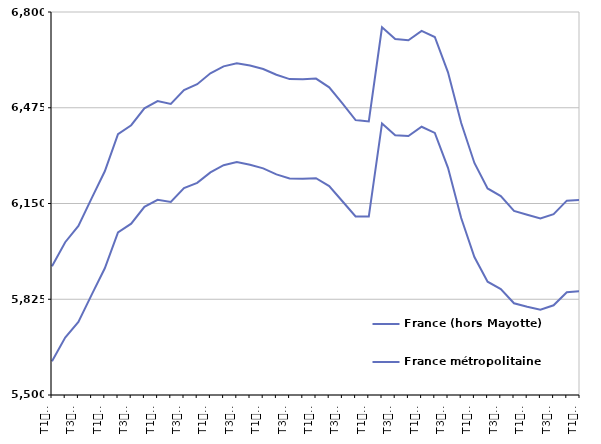
| Category | France (hors Mayotte) | France métropolitaine |
|---|---|---|
| T1
2014 | 5936.7 | 5614.7 |
| T2
2014 | 6018.6 | 5695 |
| T3
2014 | 6073.8 | 5748 |
| T4
2014 | 6167.2 | 5839.9 |
| T1
2015 | 6259.5 | 5930.2 |
| T2
2015 | 6385.7 | 6052.2 |
| T3
2015 | 6415.7 | 6081.5 |
| T4
2015 | 6473 | 6138.8 |
| T1
2016 | 6497.6 | 6162.3 |
| T2
2016 | 6488 | 6155.3 |
| T3
2016 | 6535.1 | 6202 |
| T4
2016 | 6555 | 6220.2 |
| T1
2017 | 6591.8 | 6255.7 |
| T2
2017 | 6615.6 | 6280.1 |
| T3
2017 | 6626.1 | 6290.5 |
| T4
2017 | 6618.2 | 6281.3 |
| T1
2018 | 6606.6 | 6269.3 |
| T2
2018 | 6587.2 | 6248.7 |
| T3
2018 | 6572.3 | 6234.9 |
| T4
2018 | 6572.1 | 6234.4 |
| T1
2019 | 6573.9 | 6235.8 |
| T2
2019 | 6544.4 | 6209.1 |
| T3
2019 | 6490 | 6157.7 |
| T4
2019 | 6433.4 | 6106.2 |
| T1
2020 | 6428.3 | 6105.5 |
| T2
2020 | 6748.1 | 6421.8 |
| T3
2020 | 6708.3 | 6381.7 |
| T4
2020 | 6703.8 | 6379 |
| T1
2021 | 6736.1 | 6410.5 |
| T2
2021 | 6715.2 | 6389.5 |
| T3
2021 | 6595.1 | 6271.1 |
| T4
2021 | 6423.3 | 6100.9 |
| T1
2022 | 6287.6 | 5968.1 |
| T2
2022 | 6201.1 | 5884.5 |
| T3
2022 | 6175.2 | 5859.7 |
| T4
2022 | 6124.8 | 5811.3 |
| T1
2023 | 6112 | 5799.4 |
| T2
2023 | 6099.4 | 5789.7 |
| T3
2023 | 6113.7 | 5804.5 |
| T4
2023 | 6159.7 | 5849 |
| T1
2024 | 6162.3 | 5852.2 |